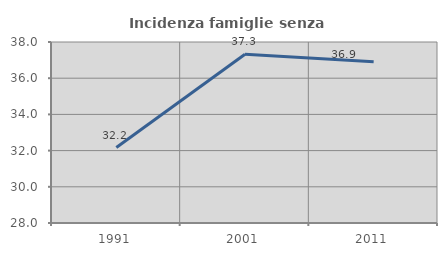
| Category | Incidenza famiglie senza nuclei |
|---|---|
| 1991.0 | 32.171 |
| 2001.0 | 37.324 |
| 2011.0 | 36.913 |